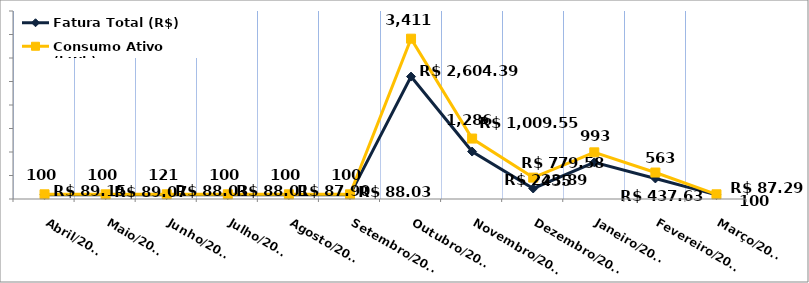
| Category | Fatura Total (R$) |
|---|---|
| Abril/2023 | 89.15 |
| Maio/2023 | 89.07 |
| Junho/2023 | 88.03 |
| Julho/2023 | 88.01 |
| Agosto/2023 | 87.9 |
| Setembro/2023 | 88.03 |
| Outubro/2023 | 2604.39 |
| Novembro/2023 | 1009.55 |
| Dezembro/2023 | 223.89 |
| Janeiro/2024 | 779.58 |
| Fevereiro/2024 | 437.63 |
| Março/2024 | 87.29 |